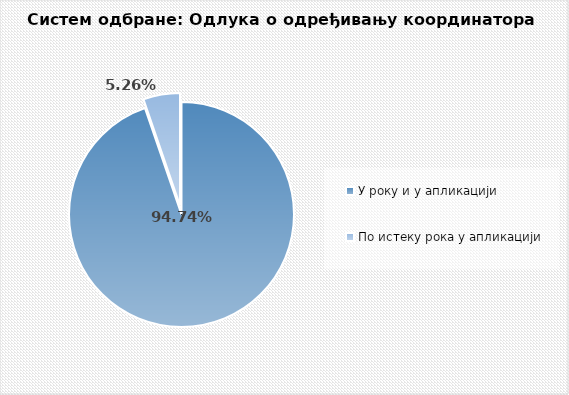
| Category | Series 0 |
|---|---|
| У року и у апликацији | 0.947 |
| По истеку рока у апликацији | 0.053 |